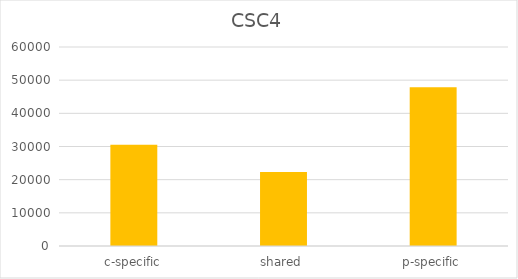
| Category | CSC4 |
|---|---|
| c-specific | 30510 |
| shared | 22302 |
| p-specific | 47891 |